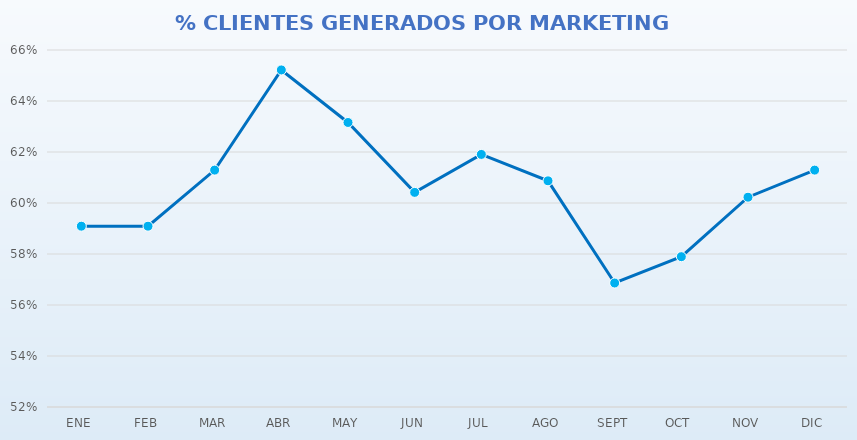
| Category | % RESULTADOS OBTENIDOS ONLINE |
|---|---|
| ENE | 0.591 |
| FEB | 0.591 |
| MAR | 0.613 |
| ABR | 0.652 |
| MAY | 0.632 |
| JUN | 0.604 |
| JUL | 0.619 |
| AGO | 0.609 |
| SEPT | 0.569 |
| OCT | 0.579 |
| NOV | 0.602 |
| DIC | 0.613 |